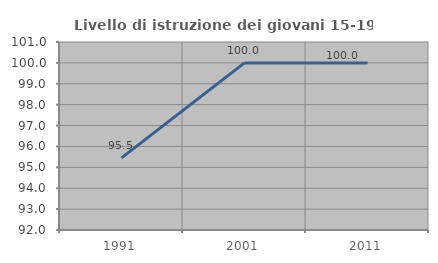
| Category | Livello di istruzione dei giovani 15-19 anni |
|---|---|
| 1991.0 | 95.455 |
| 2001.0 | 100 |
| 2011.0 | 100 |